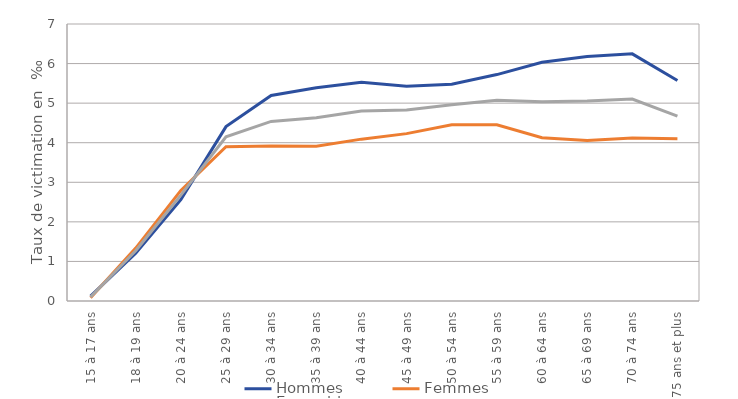
| Category | Hommes | Femmes | Ensemble |
|---|---|---|---|
| 15 à 17 ans | 0.125 | 0.08 | 0.103 |
| 18 à 19 ans | 1.208 | 1.336 | 1.27 |
| 20 à 24 ans | 2.562 | 2.794 | 2.676 |
| 25 à 29 ans | 4.407 | 3.897 | 4.149 |
| 30 à 34 ans | 5.192 | 3.918 | 4.538 |
| 35 à 39 ans | 5.389 | 3.912 | 4.633 |
| 40 à 44 ans | 5.528 | 4.09 | 4.799 |
| 45 à 49 ans | 5.428 | 4.23 | 4.824 |
| 50 à 54 ans | 5.48 | 4.455 | 4.959 |
| 55 à 59 ans | 5.722 | 4.453 | 5.07 |
| 60 à 64 ans | 6.032 | 4.126 | 5.035 |
| 65 à 69 ans | 6.18 | 4.055 | 5.056 |
| 70 à 74 ans | 6.246 | 4.121 | 5.105 |
| 75 ans et plus | 5.572 | 4.099 | 4.672 |